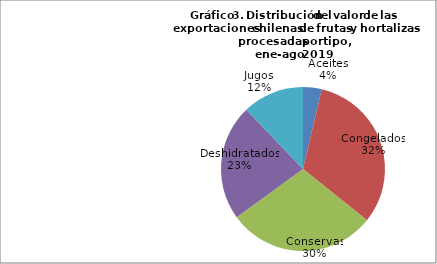
| Category | Series 0 |
|---|---|
| Aceites | 36845493.97 |
| Congelados | 320481134.89 |
| Conservas | 292417896.05 |
| Deshidratados | 228492149.06 |
| Jugos | 121376618.7 |